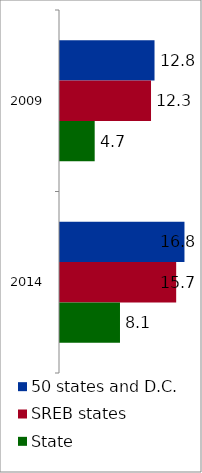
| Category | 50 states and D.C. | SREB states | State |
|---|---|---|---|
| 2009 | 12.793 | 12.318 | 4.695 |
| 2014 | 16.846 | 15.724 | 8.119 |